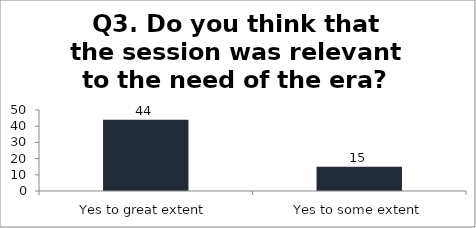
| Category | Q3. Do you think that the session was relevant to the need of the era? |
|---|---|
| Yes to great extent | 44 |
| Yes to some extent | 15 |